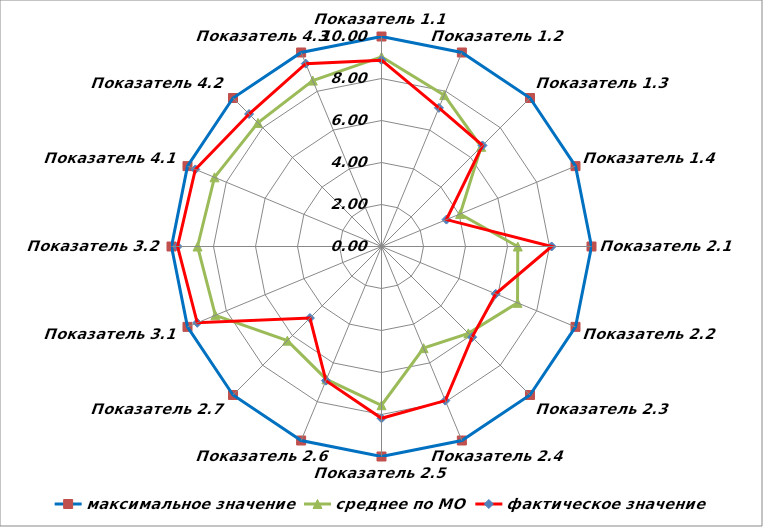
| Category | максимальное значение | среднее по МО | фактическое значение |
|---|---|---|---|
| Показатель 1.1 | 10 | 9.033 | 8.872 |
| Показатель 1.2 | 10 | 7.803 | 7.147 |
| Показатель 1.3 | 10 | 6.713 | 6.802 |
| Показатель 1.4 | 10 | 4.051 | 3.347 |
| Показатель 2.1 | 10 | 6.489 | 8.102 |
| Показатель 2.2 | 10 | 7.011 | 5.889 |
| Показатель 2.3 | 10 | 5.851 | 6.105 |
| Показатель 2.4 | 10 | 5.239 | 7.944 |
| Показатель 2.5 | 10 | 7.56 | 8.18 |
| Показатель 2.6 | 10 | 6.849 | 6.915 |
| Показатель 2.7 | 10 | 6.342 | 4.819 |
| Показатель 3.1 | 10 | 8.563 | 9.496 |
| Показатель 3.2 | 10 | 8.76 | 9.712 |
| Показатель 4.1 | 10 | 8.608 | 9.595 |
| Показатель 4.2 | 10 | 8.323 | 8.921 |
| Показатель 4.3 | 10 | 8.551 | 9.424 |